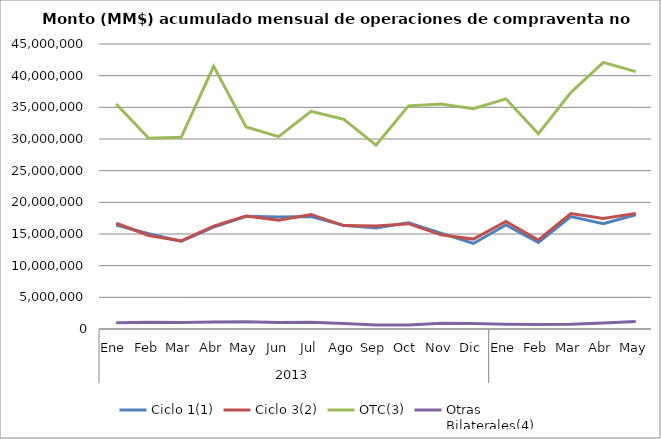
| Category | Ciclo 1(1) | Ciclo 3(2) | OTC(3) | Otras
Bilaterales(4) |
|---|---|---|---|---|
| 0 | 16417241.727 | 16700335.202 | 35523809.408 | 972958.086 |
| 1 | 15037741.172 | 14773657.586 | 30102338.851 | 1073496.596 |
| 2 | 13848943.779 | 13900402.205 | 30273669.122 | 1026617.054 |
| 3 | 16086096.035 | 16245696.168 | 41465554.082 | 1105720.368 |
| 4 | 17801790.619 | 17838763.351 | 31909646.654 | 1133512.85 |
| 5 | 17684542.956 | 17179330.609 | 30372188.279 | 1025162.543 |
| 6 | 17771623.451 | 18089502.524 | 34376831.202 | 1053340.718 |
| 7 | 16359818.954 | 16327115.519 | 33128143.288 | 882723.558 |
| 8 | 15949862.744 | 16281684.387 | 29025705.039 | 624893.462 |
| 9 | 16760948.703 | 16634867.291 | 35234004.542 | 641647.876 |
| 10 | 15133528.556 | 14863555.208 | 35512550.02 | 915020.525 |
| 11 | 13509827.678 | 14192849.668 | 34769513.126 | 877765.247 |
| 12 | 16434121.823 | 16973216.875 | 36341658.718 | 750147.378 |
| 13 | 13675521.943 | 14060199.134 | 30828680.35 | 721919.806 |
| 14 | 17760484.117 | 18231676.991 | 37344676.439 | 768460.999 |
| 15 | 16615436.994 | 17468955.339 | 42094978.158 | 945494.284 |
| 16 | 18046213.572 | 18258193.447 | 40638812.154 | 1185202.419 |